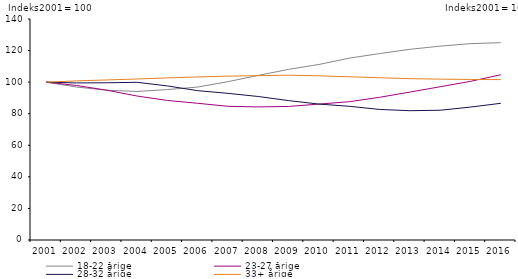
| Category | 18-22 årige | 23-27 årige | 28-32 årige | 33+ årige |
|---|---|---|---|---|
| 2001.0 | 100 | 100 | 100 | 100 |
| 2002.0 | 96.9 | 97.9 | 99.5 | 100.8 |
| 2003.0 | 94.9 | 94.9 | 99.6 | 101.4 |
| 2004.0 | 94.1 | 91.2 | 99.9 | 102 |
| 2005.0 | 95.3 | 88.4 | 97.6 | 102.7 |
| 2006.0 | 96.9 | 86.6 | 94.6 | 103.3 |
| 2007.0 | 100.3 | 84.7 | 92.9 | 103.8 |
| 2008.0 | 104.3 | 84.3 | 90.9 | 104.1 |
| 2009.0 | 108.1 | 84.6 | 88.3 | 104.4 |
| 2010.0 | 111.2 | 86.1 | 86.1 | 104 |
| 2011.0 | 115.2 | 87.6 | 84.7 | 103.4 |
| 2012.0 | 118.1 | 90.4 | 82.7 | 102.8 |
| 2013.0 | 120.8 | 93.7 | 81.9 | 102.2 |
| 2014.0 | 122.8 | 97.1 | 82.2 | 101.9 |
| 2015.0 | 124.4 | 100.5 | 84.2 | 101.7 |
| 2016.0 | 125 | 104.7 | 86.6 | 101.6 |